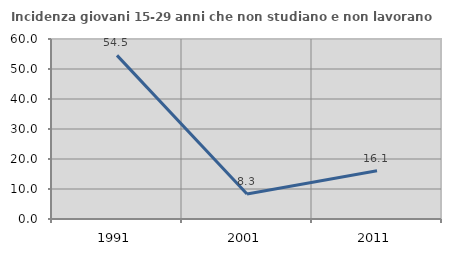
| Category | Incidenza giovani 15-29 anni che non studiano e non lavorano  |
|---|---|
| 1991.0 | 54.545 |
| 2001.0 | 8.333 |
| 2011.0 | 16.071 |